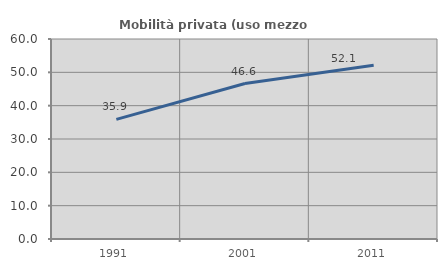
| Category | Mobilità privata (uso mezzo privato) |
|---|---|
| 1991.0 | 35.902 |
| 2001.0 | 46.649 |
| 2011.0 | 52.134 |